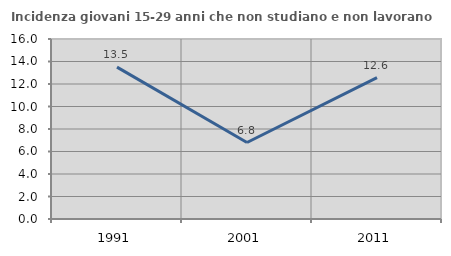
| Category | Incidenza giovani 15-29 anni che non studiano e non lavorano  |
|---|---|
| 1991.0 | 13.499 |
| 2001.0 | 6.8 |
| 2011.0 | 12.573 |